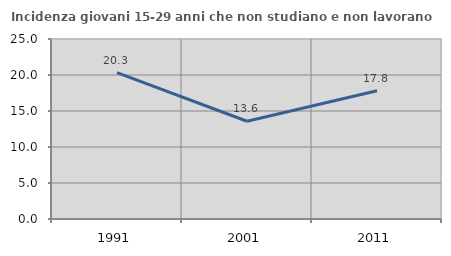
| Category | Incidenza giovani 15-29 anni che non studiano e non lavorano  |
|---|---|
| 1991.0 | 20.333 |
| 2001.0 | 13.573 |
| 2011.0 | 17.807 |